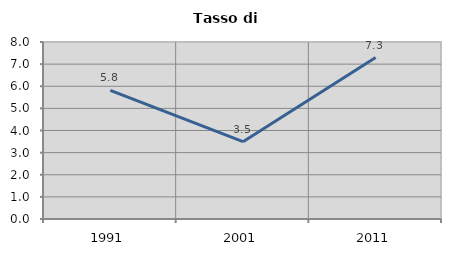
| Category | Tasso di disoccupazione   |
|---|---|
| 1991.0 | 5.812 |
| 2001.0 | 3.494 |
| 2011.0 | 7.295 |